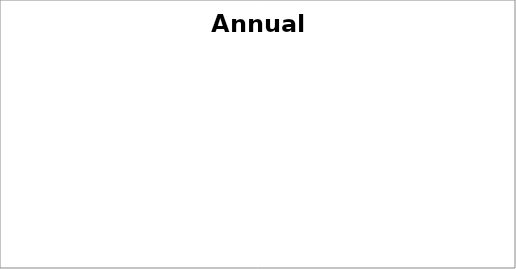
| Category | Series 0 |
|---|---|
| Salary | 0 |
| Bonus | 0 |
| Open | 0 |
| Open | 0 |
| Open | 0 |
| Open | 0 |
| Open | 0 |
| Open  | 0 |
| Open | 0 |